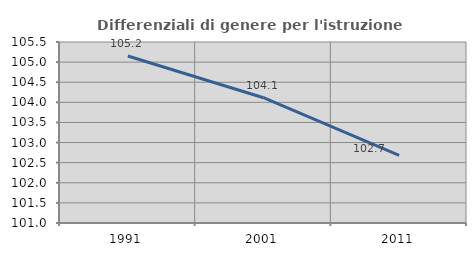
| Category | Differenziali di genere per l'istruzione superiore |
|---|---|
| 1991.0 | 105.153 |
| 2001.0 | 104.115 |
| 2011.0 | 102.68 |